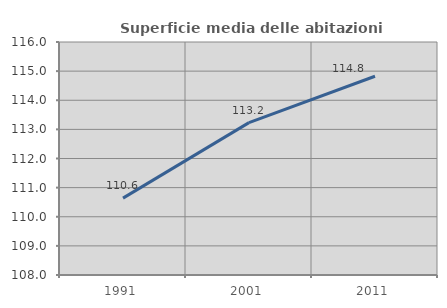
| Category | Superficie media delle abitazioni occupate |
|---|---|
| 1991.0 | 110.641 |
| 2001.0 | 113.232 |
| 2011.0 | 114.825 |